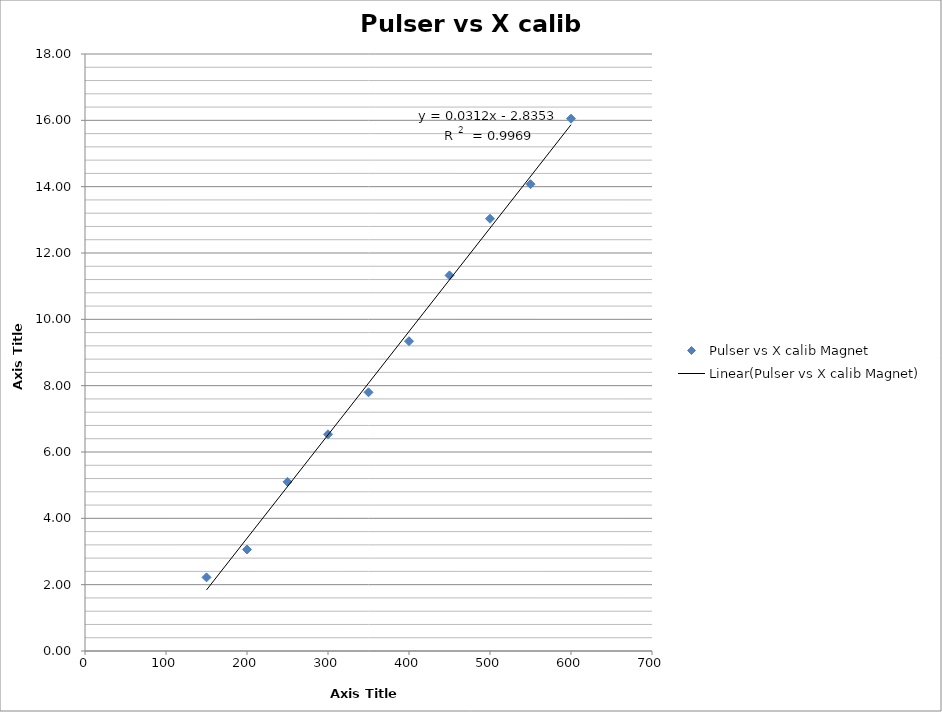
| Category | Pulser vs X calib Magnet |
|---|---|
| 150.0 | 2.22 |
| 200.0 | 3.06 |
| 250.0 | 5.1 |
| 300.0 | 6.533 |
| 350.0 | 7.8 |
| 400.0 | 9.34 |
| 450.0 | 11.325 |
| 500.0 | 13.033 |
| 550.0 | 14.075 |
| 600.0 | 16.05 |